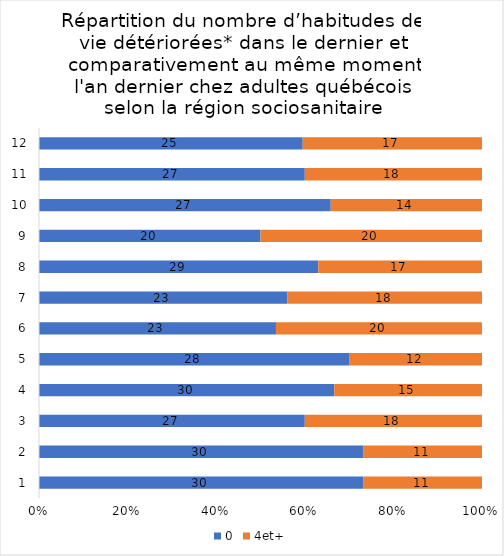
| Category | 0 | 4et+ |
|---|---|---|
| 0 | 30 | 11 |
| 1 | 30 | 11 |
| 2 | 27 | 18 |
| 3 | 30 | 15 |
| 4 | 28 | 12 |
| 5 | 23 | 20 |
| 6 | 23 | 18 |
| 7 | 29 | 17 |
| 8 | 20 | 20 |
| 9 | 27 | 14 |
| 10 | 27 | 18 |
| 11 | 25 | 17 |